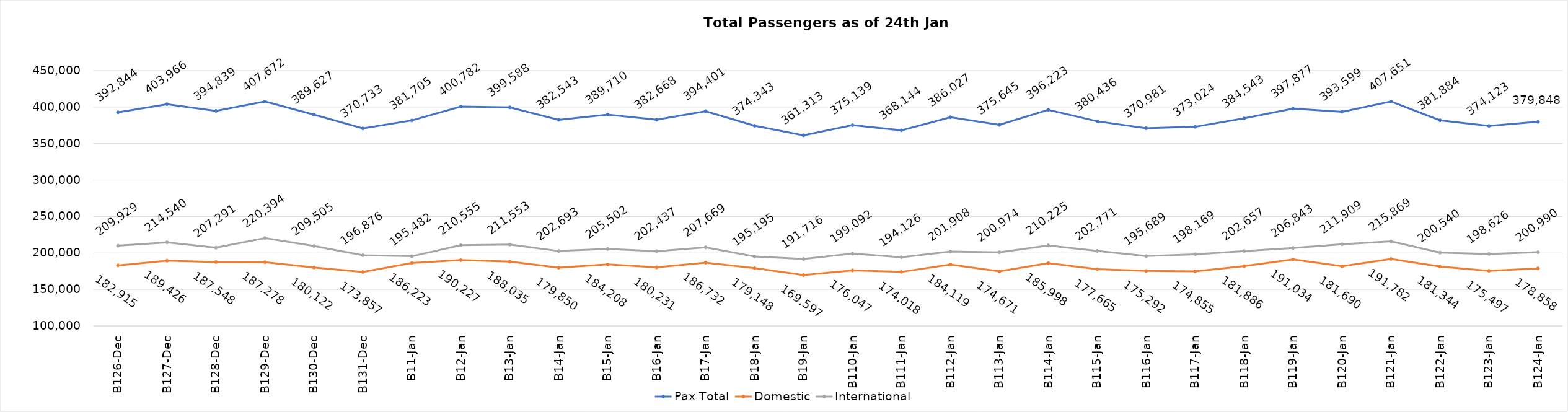
| Category | Pax Total | Domestic | International |
|---|---|---|---|
| 2023-12-26 | 392844 | 182915 | 209929 |
| 2023-12-27 | 403966 | 189426 | 214540 |
| 2023-12-28 | 394839 | 187548 | 207291 |
| 2023-12-29 | 407672 | 187278 | 220394 |
| 2023-12-30 | 389627 | 180122 | 209505 |
| 2023-12-31 | 370733 | 173857 | 196876 |
| 2024-01-01 | 381705 | 186223 | 195482 |
| 2024-01-02 | 400782 | 190227 | 210555 |
| 2024-01-03 | 399588 | 188035 | 211553 |
| 2024-01-04 | 382543 | 179850 | 202693 |
| 2024-01-05 | 389710 | 184208 | 205502 |
| 2024-01-06 | 382668 | 180231 | 202437 |
| 2024-01-07 | 394401 | 186732 | 207669 |
| 2024-01-08 | 374343 | 179148 | 195195 |
| 2024-01-09 | 361313 | 169597 | 191716 |
| 2024-01-10 | 375139 | 176047 | 199092 |
| 2024-01-11 | 368144 | 174018 | 194126 |
| 2024-01-12 | 386027 | 184119 | 201908 |
| 2024-01-13 | 375645 | 174671 | 200974 |
| 2024-01-14 | 396223 | 185998 | 210225 |
| 2024-01-15 | 380436 | 177665 | 202771 |
| 2024-01-16 | 370981 | 175292 | 195689 |
| 2024-01-17 | 373024 | 174855 | 198169 |
| 2024-01-18 | 384543 | 181886 | 202657 |
| 2024-01-19 | 397877 | 191034 | 206843 |
| 2024-01-20 | 393599 | 181690 | 211909 |
| 2024-01-21 | 407651 | 191782 | 215869 |
| 2024-01-22 | 381884 | 181344 | 200540 |
| 2024-01-23 | 374123 | 175497 | 198626 |
| 2024-01-24 | 379848 | 178858 | 200990 |